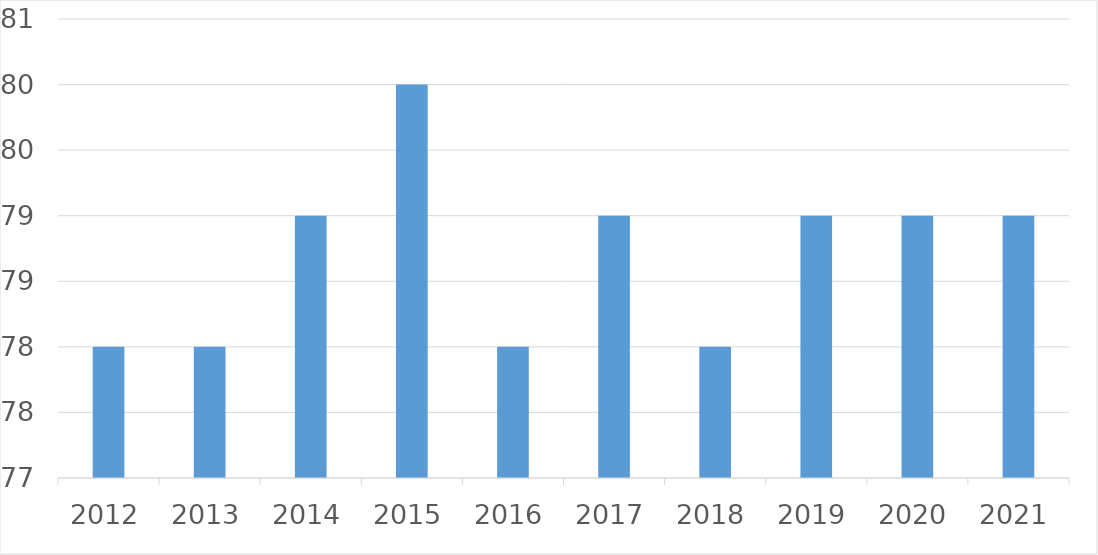
| Category | Series 0 |
|---|---|
| 2012 | 78 |
| 2013 | 78 |
| 2014 | 79 |
| 2015 | 80 |
| 2016 | 78 |
| 2017 | 79 |
| 2018 | 78 |
| 2019 | 79 |
| 2020 | 79 |
| 2021 | 79 |